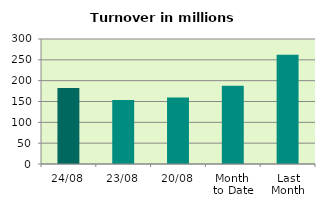
| Category | Series 0 |
|---|---|
| 24/08 | 182.584 |
| 23/08 | 153.707 |
| 20/08 | 159.745 |
| Month 
to Date | 187.904 |
| Last
Month | 262.308 |